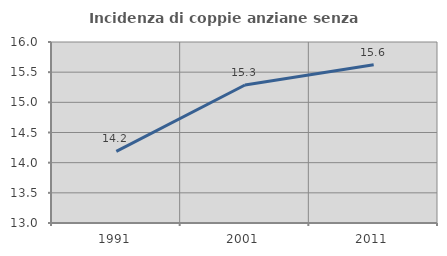
| Category | Incidenza di coppie anziane senza figli  |
|---|---|
| 1991.0 | 14.186 |
| 2001.0 | 15.288 |
| 2011.0 | 15.622 |